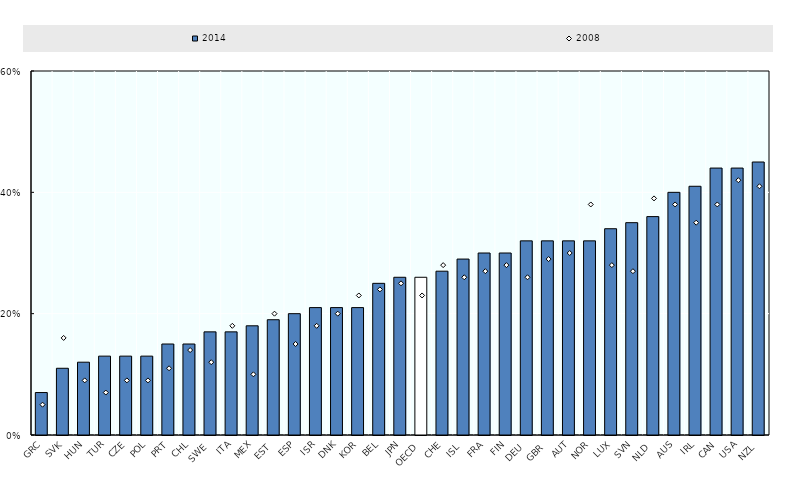
| Category | 2014 |
|---|---|
| GRC | 0.07 |
| SVK | 0.11 |
| HUN | 0.12 |
| TUR | 0.13 |
| CZE | 0.13 |
| POL | 0.13 |
| PRT | 0.15 |
| CHL | 0.15 |
| SWE | 0.17 |
| ITA | 0.17 |
| MEX | 0.18 |
| EST | 0.19 |
| ESP | 0.2 |
| ISR | 0.21 |
| DNK | 0.21 |
| KOR | 0.21 |
| BEL | 0.25 |
| JPN | 0.26 |
| OECD | 0.26 |
| CHE | 0.27 |
| ISL | 0.29 |
| FRA | 0.3 |
| FIN | 0.3 |
| DEU | 0.32 |
| GBR | 0.32 |
| AUT | 0.32 |
| NOR | 0.32 |
| LUX | 0.34 |
| SVN | 0.35 |
| NLD | 0.36 |
| AUS | 0.4 |
| IRL | 0.41 |
| CAN | 0.44 |
| USA | 0.44 |
| NZL | 0.45 |